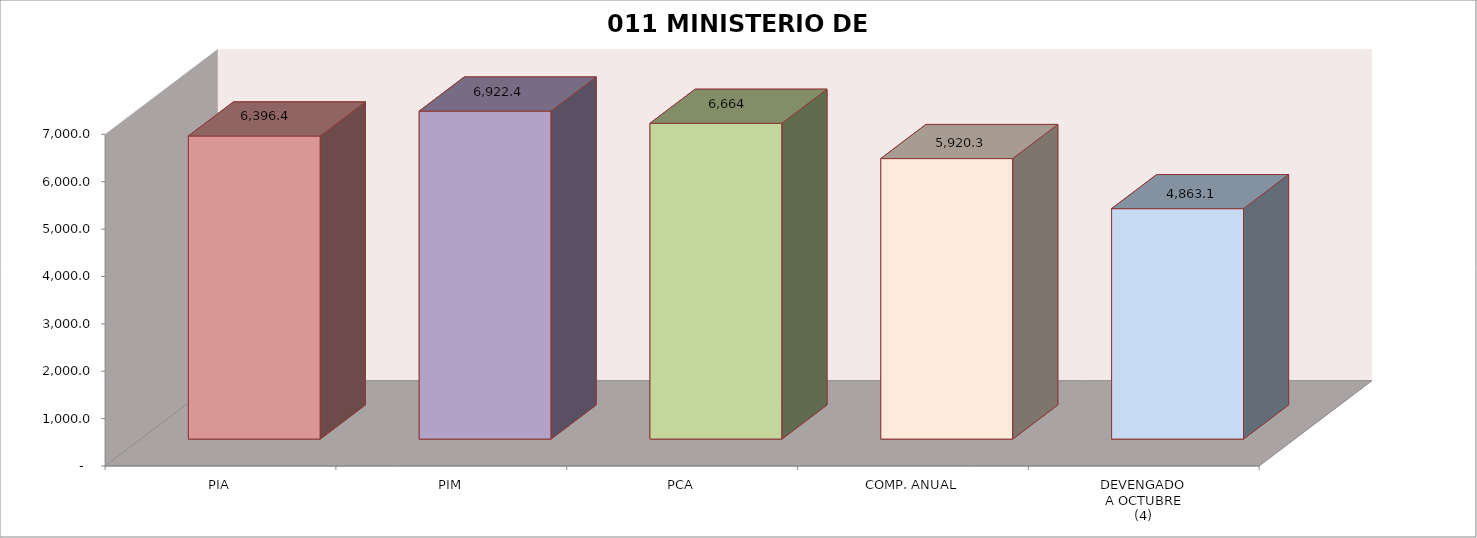
| Category | 011 MINISTERIO DE SALUD |
|---|---|
| PIA | 6396.414 |
| PIM | 6922.417 |
| PCA | 6664.382 |
| COMP. ANUAL | 5920.315 |
| DEVENGADO
A OCTUBRE
(4) | 4863.074 |